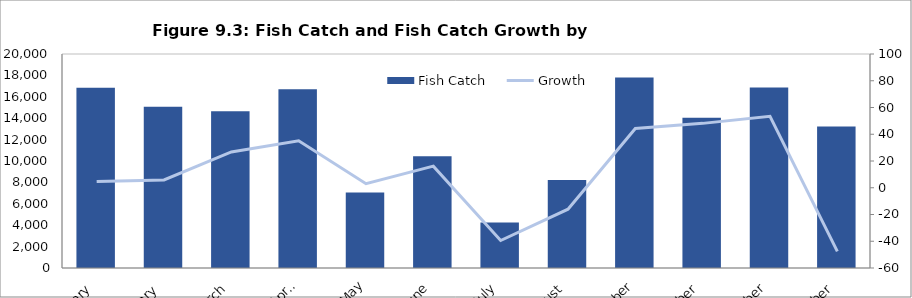
| Category | Fish Catch |
|---|---|
| January | 16852.369 |
| February | 15063.767 |
| March | 14646.504 |
| April | 16711.769 |
| May | 7052.311 |
| June | 10445.256 |
| July | 4262.756 |
| August | 8223.228 |
| September | 17803.934 |
| October | 14038.271 |
| November | 16877.465 |
| December | 13227.814 |